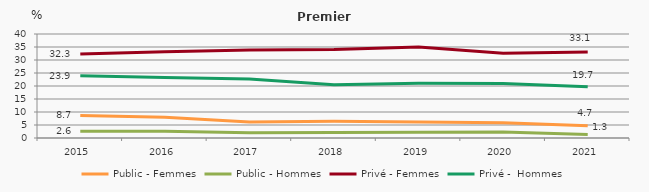
| Category | Public - Femmes | Public - Hommes | Privé - Femmes | Privé -  Hommes |
|---|---|---|---|---|
| 2015.0 | 8.7 | 2.6 | 32.3 | 23.9 |
| 2016.0 | 8 | 2.6 | 33.2 | 23.3 |
| 2017.0 | 6.2 | 2 | 33.8 | 22.7 |
| 2018.0 | 6.4 | 2.1 | 34 | 20.5 |
| 2019.0 | 6.2 | 2.2 | 35 | 21.1 |
| 2020.0 | 5.9 | 2.3 | 32.6 | 21 |
| 2021.0 | 4.7 | 1.3 | 33.1 | 19.7 |